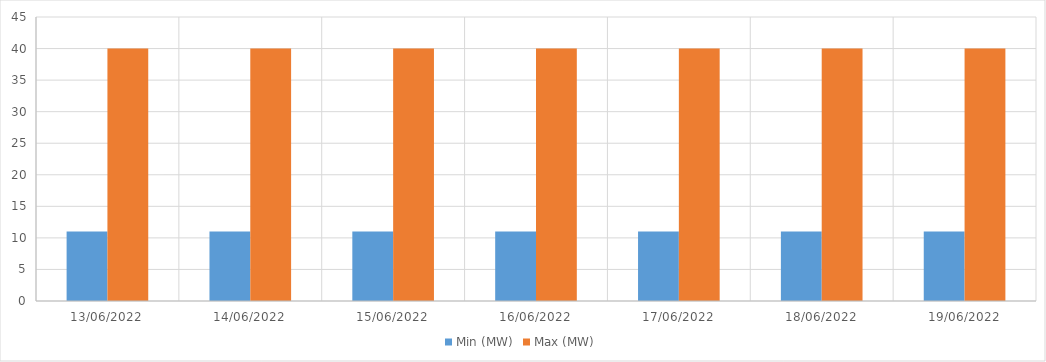
| Category | Min (MW) | Max (MW) |
|---|---|---|
| 13/06/2022 | 11 | 40 |
| 14/06/2022 | 11 | 40 |
| 15/06/2022 | 11 | 40 |
| 16/06/2022 | 11 | 40 |
| 17/06/2022 | 11 | 40 |
| 18/06/2022 | 11 | 40 |
| 19/06/2022 | 11 | 40 |